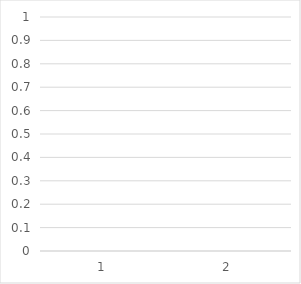
| Category | Series 0 |
|---|---|
| 0 | 87.136 |
| 1 | 72.608 |